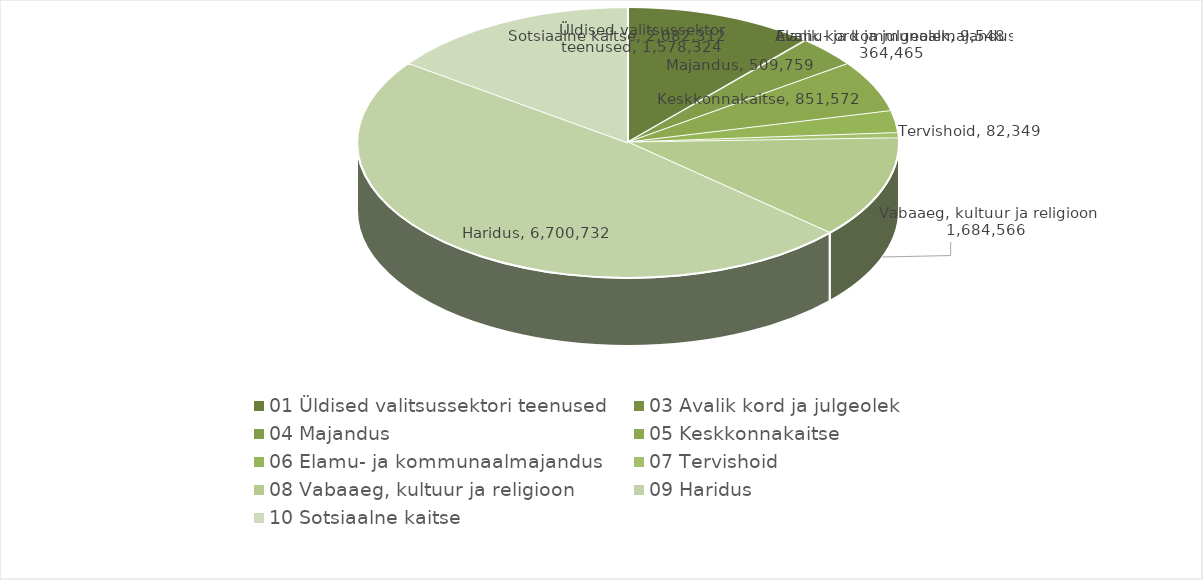
| Category | Series 0 |
|---|---|
| 0 | 1578324 |
| 1 | 9548 |
| 2 | 509759 |
| 3 | 851572 |
| 4 | 364465 |
| 5 | 82349 |
| 6 | 1684566 |
| 7 | 6700732 |
| 8 | 2082312 |